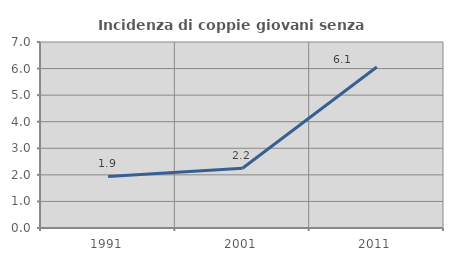
| Category | Incidenza di coppie giovani senza figli |
|---|---|
| 1991.0 | 1.942 |
| 2001.0 | 2.247 |
| 2011.0 | 6.061 |